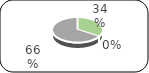
| Category | Series 0 |
|---|---|
| 0 | 9873.15 |
| 1 | 0 |
| 2 | 19134.9 |